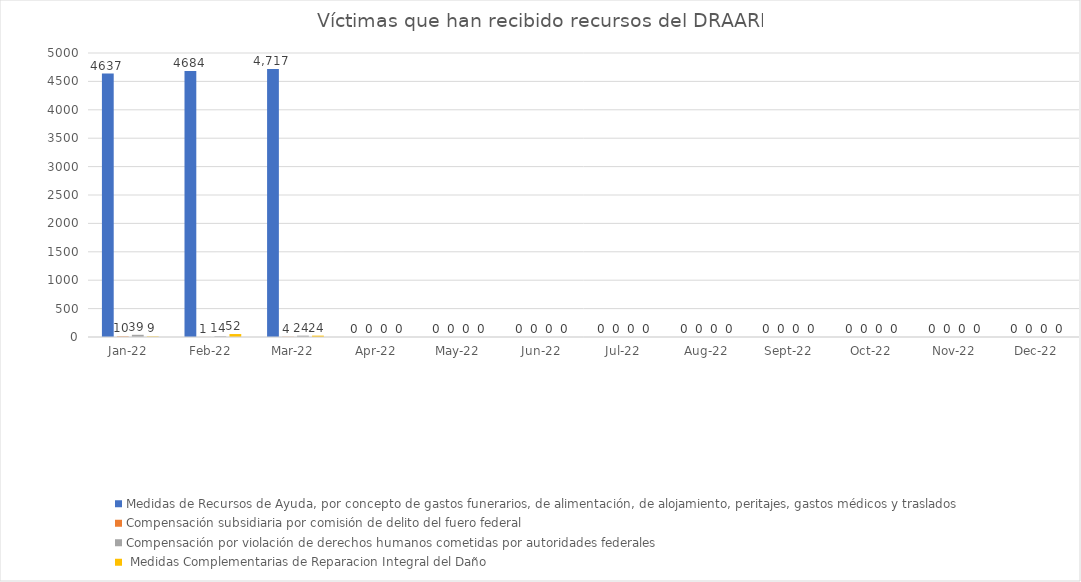
| Category | Medidas de Recursos de Ayuda, por concepto de gastos funerarios, de alimentación, de alojamiento, peritajes, gastos médicos y traslados | Compensación subsidiaria por comisión de delito del fuero federal | Compensación por violación de derechos humanos cometidas por autoridades federales |  Medidas Complementarias de Reparacion Integral del Daño |
|---|---|---|---|---|
| 2022-01-01 | 4637 | 10 | 39 | 9 |
| 2022-02-01 | 4684 | 1 | 14 | 52 |
| 2022-03-01 | 4717 | 4 | 24 | 24 |
| 2022-04-01 | 0 | 0 | 0 | 0 |
| 2022-05-01 | 0 | 0 | 0 | 0 |
| 2022-06-01 | 0 | 0 | 0 | 0 |
| 2022-07-01 | 0 | 0 | 0 | 0 |
| 2022-08-01 | 0 | 0 | 0 | 0 |
| 2022-09-01 | 0 | 0 | 0 | 0 |
| 2022-10-01 | 0 | 0 | 0 | 0 |
| 2022-11-01 | 0 | 0 | 0 | 0 |
| 2022-12-01 | 0 | 0 | 0 | 0 |